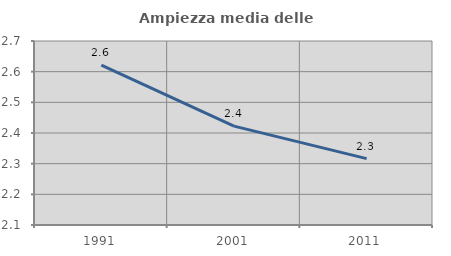
| Category | Ampiezza media delle famiglie |
|---|---|
| 1991.0 | 2.621 |
| 2001.0 | 2.422 |
| 2011.0 | 2.317 |